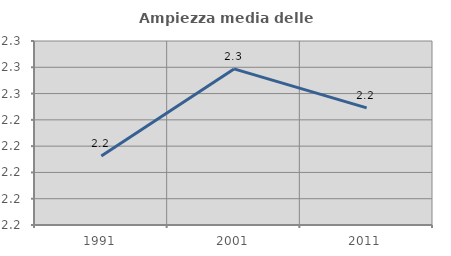
| Category | Ampiezza media delle famiglie |
|---|---|
| 1991.0 | 2.213 |
| 2001.0 | 2.279 |
| 2011.0 | 2.249 |